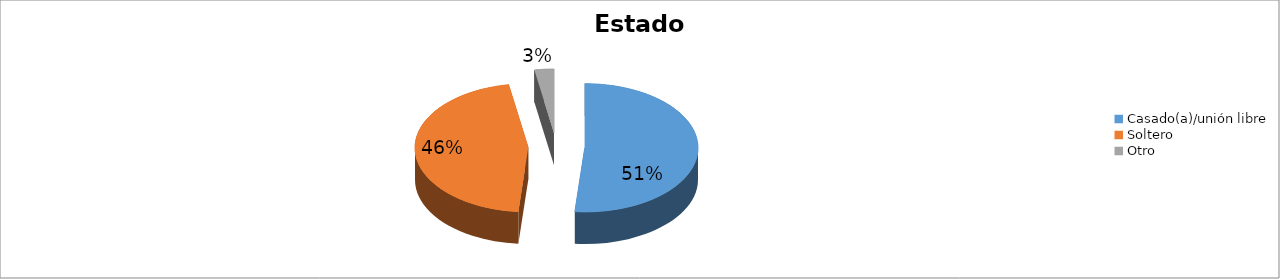
| Category | Series 0 |
|---|---|
| Casado(a)/unión libre | 0.514 |
| Soltero | 0.458 |
| Otro | 0.028 |